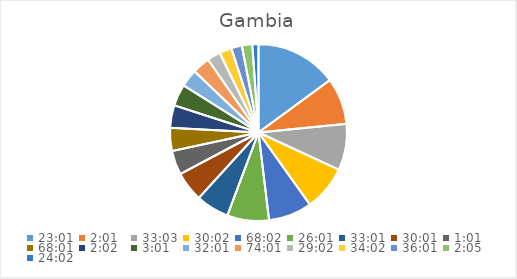
| Category | Series 0 |
|---|---|
| 0.9590277777777777 | 15.943 |
| 0.08402777777777777 | 9.098 |
| 1.3770833333333332 | 9.032 |
| 1.2513888888888889 | 8.812 |
| 2.834722222222222 | 8.484 |
| 1.0840277777777778 | 8.158 |
| 1.3756944444444443 | 6.451 |
| 1.2506944444444443 | 5.845 |
| 0.042361111111111106 | 4.695 |
| 2.8340277777777776 | 4.533 |
| 0.08472222222222221 | 4.371 |
| 0.12569444444444444 | 4.23 |
| 1.3340277777777778 | 3.451 |
| 3.0840277777777776 | 3.431 |
| 1.2097222222222224 | 2.586 |
| 1.4180555555555554 | 2.41 |
| 1.5006944444444443 | 2.081 |
| 0.08680555555555557 | 2.023 |
| 1.0013888888888889 | 1.2 |